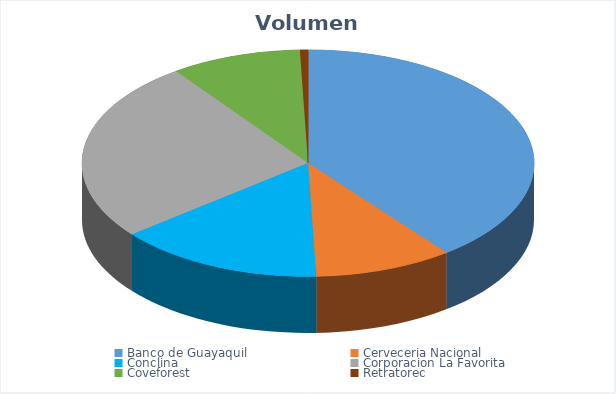
| Category | VOLUMEN ($USD) |
|---|---|
| Banco de Guayaquil | 55101.86 |
| Cerveceria Nacional | 13800 |
| Conclina | 20586 |
| Corporacion La Favorita | 36132.93 |
| Coveforest | 13000 |
| Retratorec | 794.5 |